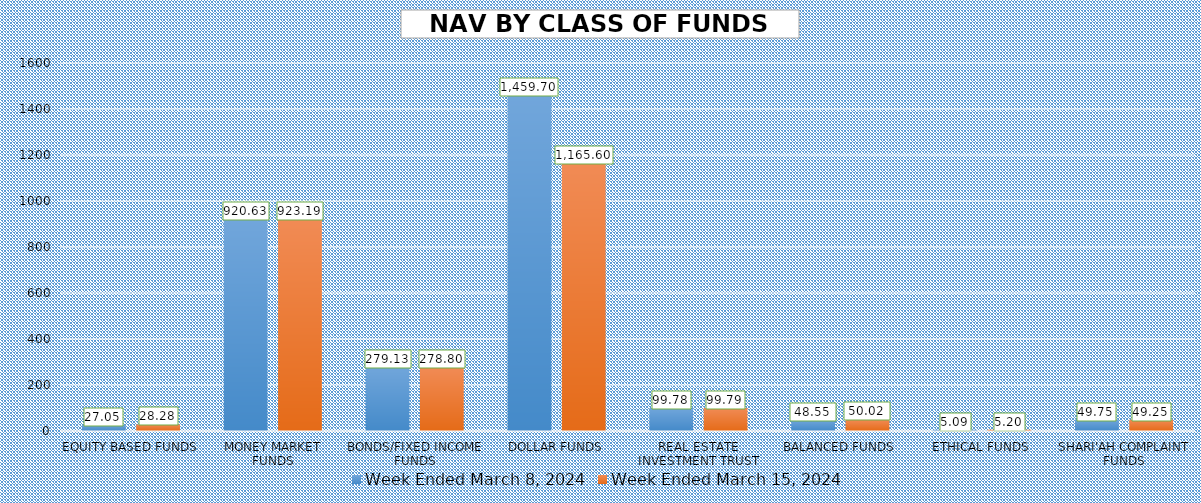
| Category | Week Ended March 8, 2024 | Week Ended March 15, 2024 |
|---|---|---|
| EQUITY BASED FUNDS | 27.05 | 28.276 |
| MONEY MARKET FUNDS | 920.626 | 923.191 |
| BONDS/FIXED INCOME FUNDS | 279.126 | 278.795 |
| DOLLAR FUNDS | 1459.705 | 1165.595 |
| REAL ESTATE INVESTMENT TRUST | 99.779 | 99.793 |
| BALANCED FUNDS | 48.553 | 50.02 |
| ETHICAL FUNDS | 5.09 | 5.201 |
| SHARI'AH COMPLAINT FUNDS | 49.747 | 49.249 |